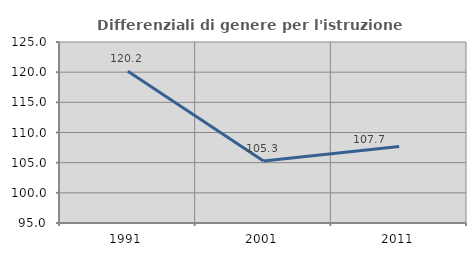
| Category | Differenziali di genere per l'istruzione superiore |
|---|---|
| 1991.0 | 120.163 |
| 2001.0 | 105.285 |
| 2011.0 | 107.694 |